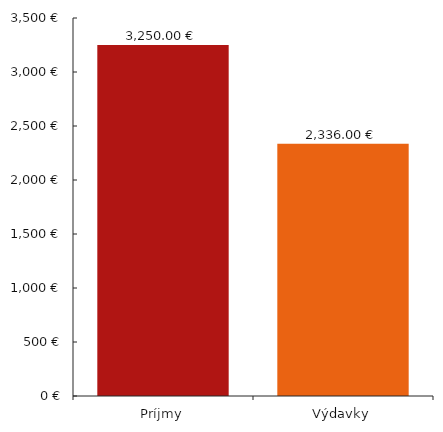
| Category | Data_grafu |
|---|---|
| 0 | 3250 |
| 1 | 2336 |